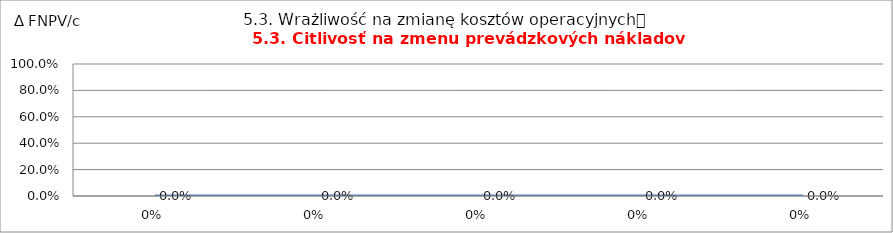
| Category | 5.3. Wrażliwość na zmianę kosztów operacyjnych
5.3. Citlivosť na zmenu prevádzkových nákladov |
|---|---|
| 0.0 | 0 |
| 0.0 | 0 |
| 0.0 | 0 |
| 0.0 | 0 |
| 0.0 | 0 |